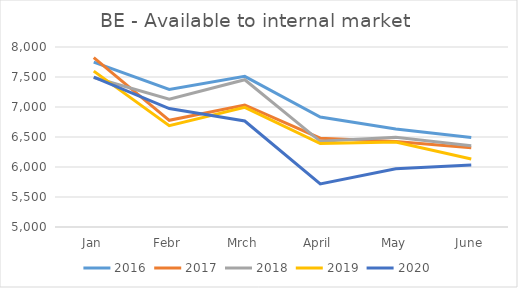
| Category | 2016 | 2017 | 2018 | 2019 | 2020 |
|---|---|---|---|---|---|
| Jan | 7749 | 7821.644 | 7492.472 | 7598.43 | 7496.76 |
| Febr | 7293 | 6778.638 | 7130.65 | 6688.507 | 6974.19 |
| Mrch | 7511 | 7034.123 | 7454.69 | 6993.838 | 6766.413 |
| April | 6833 | 6480.252 | 6427.922 | 6391.474 | 5716.559 |
| May | 6635 | 6425.014 | 6496.643 | 6415.349 | 5970.445 |
| June | 6491 | 6322.474 | 6355.8 | 6132.191 | 6031.837 |